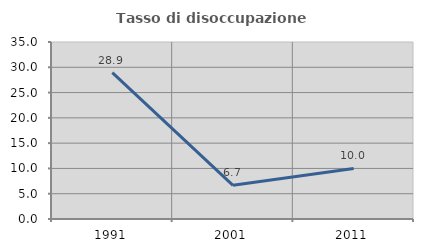
| Category | Tasso di disoccupazione giovanile  |
|---|---|
| 1991.0 | 28.947 |
| 2001.0 | 6.667 |
| 2011.0 | 10 |